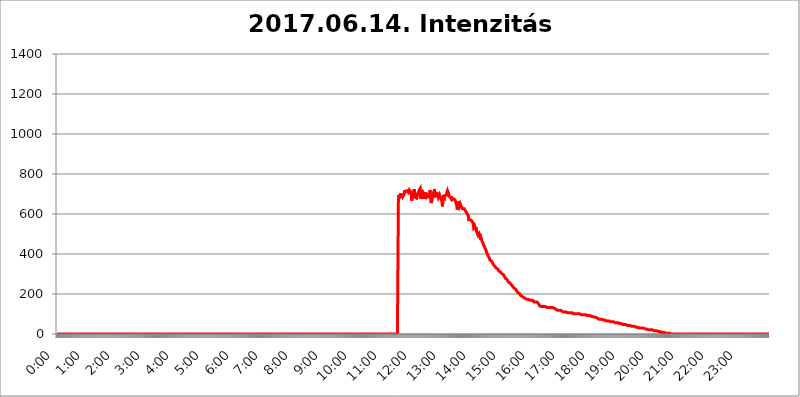
| Category | 2017.06.14. Intenzitás [W/m^2] |
|---|---|
| 0.0 | 0 |
| 0.0006944444444444445 | 0 |
| 0.001388888888888889 | 0 |
| 0.0020833333333333333 | 0 |
| 0.002777777777777778 | 0 |
| 0.003472222222222222 | 0 |
| 0.004166666666666667 | 0 |
| 0.004861111111111111 | 0 |
| 0.005555555555555556 | 0 |
| 0.0062499999999999995 | 0 |
| 0.006944444444444444 | 0 |
| 0.007638888888888889 | 0 |
| 0.008333333333333333 | 0 |
| 0.009027777777777779 | 0 |
| 0.009722222222222222 | 0 |
| 0.010416666666666666 | 0 |
| 0.011111111111111112 | 0 |
| 0.011805555555555555 | 0 |
| 0.012499999999999999 | 0 |
| 0.013194444444444444 | 0 |
| 0.013888888888888888 | 0 |
| 0.014583333333333332 | 0 |
| 0.015277777777777777 | 0 |
| 0.015972222222222224 | 0 |
| 0.016666666666666666 | 0 |
| 0.017361111111111112 | 0 |
| 0.018055555555555557 | 0 |
| 0.01875 | 0 |
| 0.019444444444444445 | 0 |
| 0.02013888888888889 | 0 |
| 0.020833333333333332 | 0 |
| 0.02152777777777778 | 0 |
| 0.022222222222222223 | 0 |
| 0.02291666666666667 | 0 |
| 0.02361111111111111 | 0 |
| 0.024305555555555556 | 0 |
| 0.024999999999999998 | 0 |
| 0.025694444444444447 | 0 |
| 0.02638888888888889 | 0 |
| 0.027083333333333334 | 0 |
| 0.027777777777777776 | 0 |
| 0.02847222222222222 | 0 |
| 0.029166666666666664 | 0 |
| 0.029861111111111113 | 0 |
| 0.030555555555555555 | 0 |
| 0.03125 | 0 |
| 0.03194444444444445 | 0 |
| 0.03263888888888889 | 0 |
| 0.03333333333333333 | 0 |
| 0.034027777777777775 | 0 |
| 0.034722222222222224 | 0 |
| 0.035416666666666666 | 0 |
| 0.036111111111111115 | 0 |
| 0.03680555555555556 | 0 |
| 0.0375 | 0 |
| 0.03819444444444444 | 0 |
| 0.03888888888888889 | 0 |
| 0.03958333333333333 | 0 |
| 0.04027777777777778 | 0 |
| 0.04097222222222222 | 0 |
| 0.041666666666666664 | 0 |
| 0.042361111111111106 | 0 |
| 0.04305555555555556 | 0 |
| 0.043750000000000004 | 0 |
| 0.044444444444444446 | 0 |
| 0.04513888888888889 | 0 |
| 0.04583333333333334 | 0 |
| 0.04652777777777778 | 0 |
| 0.04722222222222222 | 0 |
| 0.04791666666666666 | 0 |
| 0.04861111111111111 | 0 |
| 0.049305555555555554 | 0 |
| 0.049999999999999996 | 0 |
| 0.05069444444444445 | 0 |
| 0.051388888888888894 | 0 |
| 0.052083333333333336 | 0 |
| 0.05277777777777778 | 0 |
| 0.05347222222222222 | 0 |
| 0.05416666666666667 | 0 |
| 0.05486111111111111 | 0 |
| 0.05555555555555555 | 0 |
| 0.05625 | 0 |
| 0.05694444444444444 | 0 |
| 0.057638888888888885 | 0 |
| 0.05833333333333333 | 0 |
| 0.05902777777777778 | 0 |
| 0.059722222222222225 | 0 |
| 0.06041666666666667 | 0 |
| 0.061111111111111116 | 0 |
| 0.06180555555555556 | 0 |
| 0.0625 | 0 |
| 0.06319444444444444 | 0 |
| 0.06388888888888888 | 0 |
| 0.06458333333333334 | 0 |
| 0.06527777777777778 | 0 |
| 0.06597222222222222 | 0 |
| 0.06666666666666667 | 0 |
| 0.06736111111111111 | 0 |
| 0.06805555555555555 | 0 |
| 0.06874999999999999 | 0 |
| 0.06944444444444443 | 0 |
| 0.07013888888888889 | 0 |
| 0.07083333333333333 | 0 |
| 0.07152777777777779 | 0 |
| 0.07222222222222223 | 0 |
| 0.07291666666666667 | 0 |
| 0.07361111111111111 | 0 |
| 0.07430555555555556 | 0 |
| 0.075 | 0 |
| 0.07569444444444444 | 0 |
| 0.0763888888888889 | 0 |
| 0.07708333333333334 | 0 |
| 0.07777777777777778 | 0 |
| 0.07847222222222222 | 0 |
| 0.07916666666666666 | 0 |
| 0.0798611111111111 | 0 |
| 0.08055555555555556 | 0 |
| 0.08125 | 0 |
| 0.08194444444444444 | 0 |
| 0.08263888888888889 | 0 |
| 0.08333333333333333 | 0 |
| 0.08402777777777777 | 0 |
| 0.08472222222222221 | 0 |
| 0.08541666666666665 | 0 |
| 0.08611111111111112 | 0 |
| 0.08680555555555557 | 0 |
| 0.08750000000000001 | 0 |
| 0.08819444444444445 | 0 |
| 0.08888888888888889 | 0 |
| 0.08958333333333333 | 0 |
| 0.09027777777777778 | 0 |
| 0.09097222222222222 | 0 |
| 0.09166666666666667 | 0 |
| 0.09236111111111112 | 0 |
| 0.09305555555555556 | 0 |
| 0.09375 | 0 |
| 0.09444444444444444 | 0 |
| 0.09513888888888888 | 0 |
| 0.09583333333333333 | 0 |
| 0.09652777777777777 | 0 |
| 0.09722222222222222 | 0 |
| 0.09791666666666667 | 0 |
| 0.09861111111111111 | 0 |
| 0.09930555555555555 | 0 |
| 0.09999999999999999 | 0 |
| 0.10069444444444443 | 0 |
| 0.1013888888888889 | 0 |
| 0.10208333333333335 | 0 |
| 0.10277777777777779 | 0 |
| 0.10347222222222223 | 0 |
| 0.10416666666666667 | 0 |
| 0.10486111111111111 | 0 |
| 0.10555555555555556 | 0 |
| 0.10625 | 0 |
| 0.10694444444444444 | 0 |
| 0.1076388888888889 | 0 |
| 0.10833333333333334 | 0 |
| 0.10902777777777778 | 0 |
| 0.10972222222222222 | 0 |
| 0.1111111111111111 | 0 |
| 0.11180555555555556 | 0 |
| 0.11180555555555556 | 0 |
| 0.1125 | 0 |
| 0.11319444444444444 | 0 |
| 0.11388888888888889 | 0 |
| 0.11458333333333333 | 0 |
| 0.11527777777777777 | 0 |
| 0.11597222222222221 | 0 |
| 0.11666666666666665 | 0 |
| 0.1173611111111111 | 0 |
| 0.11805555555555557 | 0 |
| 0.11944444444444445 | 0 |
| 0.12013888888888889 | 0 |
| 0.12083333333333333 | 0 |
| 0.12152777777777778 | 0 |
| 0.12222222222222223 | 0 |
| 0.12291666666666667 | 0 |
| 0.12291666666666667 | 0 |
| 0.12361111111111112 | 0 |
| 0.12430555555555556 | 0 |
| 0.125 | 0 |
| 0.12569444444444444 | 0 |
| 0.12638888888888888 | 0 |
| 0.12708333333333333 | 0 |
| 0.16875 | 0 |
| 0.12847222222222224 | 0 |
| 0.12916666666666668 | 0 |
| 0.12986111111111112 | 0 |
| 0.13055555555555556 | 0 |
| 0.13125 | 0 |
| 0.13194444444444445 | 0 |
| 0.1326388888888889 | 0 |
| 0.13333333333333333 | 0 |
| 0.13402777777777777 | 0 |
| 0.13402777777777777 | 0 |
| 0.13472222222222222 | 0 |
| 0.13541666666666666 | 0 |
| 0.1361111111111111 | 0 |
| 0.13749999999999998 | 0 |
| 0.13819444444444443 | 0 |
| 0.1388888888888889 | 0 |
| 0.13958333333333334 | 0 |
| 0.14027777777777778 | 0 |
| 0.14097222222222222 | 0 |
| 0.14166666666666666 | 0 |
| 0.1423611111111111 | 0 |
| 0.14305555555555557 | 0 |
| 0.14375000000000002 | 0 |
| 0.14444444444444446 | 0 |
| 0.1451388888888889 | 0 |
| 0.1451388888888889 | 0 |
| 0.14652777777777778 | 0 |
| 0.14722222222222223 | 0 |
| 0.14791666666666667 | 0 |
| 0.1486111111111111 | 0 |
| 0.14930555555555555 | 0 |
| 0.15 | 0 |
| 0.15069444444444444 | 0 |
| 0.15138888888888888 | 0 |
| 0.15208333333333332 | 0 |
| 0.15277777777777776 | 0 |
| 0.15347222222222223 | 0 |
| 0.15416666666666667 | 0 |
| 0.15486111111111112 | 0 |
| 0.15555555555555556 | 0 |
| 0.15625 | 0 |
| 0.15694444444444444 | 0 |
| 0.15763888888888888 | 0 |
| 0.15833333333333333 | 0 |
| 0.15902777777777777 | 0 |
| 0.15972222222222224 | 0 |
| 0.16041666666666668 | 0 |
| 0.16111111111111112 | 0 |
| 0.16180555555555556 | 0 |
| 0.1625 | 0 |
| 0.16319444444444445 | 0 |
| 0.1638888888888889 | 0 |
| 0.16458333333333333 | 0 |
| 0.16527777777777777 | 0 |
| 0.16597222222222222 | 0 |
| 0.16666666666666666 | 0 |
| 0.1673611111111111 | 0 |
| 0.16805555555555554 | 0 |
| 0.16874999999999998 | 0 |
| 0.16944444444444443 | 0 |
| 0.17013888888888887 | 0 |
| 0.1708333333333333 | 0 |
| 0.17152777777777775 | 0 |
| 0.17222222222222225 | 0 |
| 0.1729166666666667 | 0 |
| 0.17361111111111113 | 0 |
| 0.17430555555555557 | 0 |
| 0.17500000000000002 | 0 |
| 0.17569444444444446 | 0 |
| 0.1763888888888889 | 0 |
| 0.17708333333333334 | 0 |
| 0.17777777777777778 | 0 |
| 0.17847222222222223 | 0 |
| 0.17916666666666667 | 0 |
| 0.1798611111111111 | 0 |
| 0.18055555555555555 | 0 |
| 0.18125 | 0 |
| 0.18194444444444444 | 0 |
| 0.1826388888888889 | 0 |
| 0.18333333333333335 | 0 |
| 0.1840277777777778 | 0 |
| 0.18472222222222223 | 0 |
| 0.18541666666666667 | 0 |
| 0.18611111111111112 | 0 |
| 0.18680555555555556 | 0 |
| 0.1875 | 0 |
| 0.18819444444444444 | 0 |
| 0.18888888888888888 | 0 |
| 0.18958333333333333 | 0 |
| 0.19027777777777777 | 0 |
| 0.1909722222222222 | 0 |
| 0.19166666666666665 | 0 |
| 0.19236111111111112 | 0 |
| 0.19305555555555554 | 0 |
| 0.19375 | 0 |
| 0.19444444444444445 | 0 |
| 0.1951388888888889 | 0 |
| 0.19583333333333333 | 0 |
| 0.19652777777777777 | 0 |
| 0.19722222222222222 | 0 |
| 0.19791666666666666 | 0 |
| 0.1986111111111111 | 0 |
| 0.19930555555555554 | 0 |
| 0.19999999999999998 | 0 |
| 0.20069444444444443 | 0 |
| 0.20138888888888887 | 0 |
| 0.2020833333333333 | 0 |
| 0.2027777777777778 | 0 |
| 0.2034722222222222 | 0 |
| 0.2041666666666667 | 0 |
| 0.20486111111111113 | 0 |
| 0.20555555555555557 | 0 |
| 0.20625000000000002 | 0 |
| 0.20694444444444446 | 0 |
| 0.2076388888888889 | 0 |
| 0.20833333333333334 | 0 |
| 0.20902777777777778 | 0 |
| 0.20972222222222223 | 0 |
| 0.21041666666666667 | 0 |
| 0.2111111111111111 | 0 |
| 0.21180555555555555 | 0 |
| 0.2125 | 0 |
| 0.21319444444444444 | 0 |
| 0.2138888888888889 | 0 |
| 0.21458333333333335 | 0 |
| 0.2152777777777778 | 0 |
| 0.21597222222222223 | 0 |
| 0.21666666666666667 | 0 |
| 0.21736111111111112 | 0 |
| 0.21805555555555556 | 0 |
| 0.21875 | 0 |
| 0.21944444444444444 | 0 |
| 0.22013888888888888 | 0 |
| 0.22083333333333333 | 0 |
| 0.22152777777777777 | 0 |
| 0.2222222222222222 | 0 |
| 0.22291666666666665 | 0 |
| 0.2236111111111111 | 0 |
| 0.22430555555555556 | 0 |
| 0.225 | 0 |
| 0.22569444444444445 | 0 |
| 0.2263888888888889 | 0 |
| 0.22708333333333333 | 0 |
| 0.22777777777777777 | 0 |
| 0.22847222222222222 | 0 |
| 0.22916666666666666 | 0 |
| 0.2298611111111111 | 0 |
| 0.23055555555555554 | 0 |
| 0.23124999999999998 | 0 |
| 0.23194444444444443 | 0 |
| 0.23263888888888887 | 0 |
| 0.2333333333333333 | 0 |
| 0.2340277777777778 | 0 |
| 0.2347222222222222 | 0 |
| 0.2354166666666667 | 0 |
| 0.23611111111111113 | 0 |
| 0.23680555555555557 | 0 |
| 0.23750000000000002 | 0 |
| 0.23819444444444446 | 0 |
| 0.2388888888888889 | 0 |
| 0.23958333333333334 | 0 |
| 0.24027777777777778 | 0 |
| 0.24097222222222223 | 0 |
| 0.24166666666666667 | 0 |
| 0.2423611111111111 | 0 |
| 0.24305555555555555 | 0 |
| 0.24375 | 0 |
| 0.24444444444444446 | 0 |
| 0.24513888888888888 | 0 |
| 0.24583333333333335 | 0 |
| 0.2465277777777778 | 0 |
| 0.24722222222222223 | 0 |
| 0.24791666666666667 | 0 |
| 0.24861111111111112 | 0 |
| 0.24930555555555556 | 0 |
| 0.25 | 0 |
| 0.25069444444444444 | 0 |
| 0.2513888888888889 | 0 |
| 0.2520833333333333 | 0 |
| 0.25277777777777777 | 0 |
| 0.2534722222222222 | 0 |
| 0.25416666666666665 | 0 |
| 0.2548611111111111 | 0 |
| 0.2555555555555556 | 0 |
| 0.25625000000000003 | 0 |
| 0.2569444444444445 | 0 |
| 0.2576388888888889 | 0 |
| 0.25833333333333336 | 0 |
| 0.2590277777777778 | 0 |
| 0.25972222222222224 | 0 |
| 0.2604166666666667 | 0 |
| 0.2611111111111111 | 0 |
| 0.26180555555555557 | 0 |
| 0.2625 | 0 |
| 0.26319444444444445 | 0 |
| 0.2638888888888889 | 0 |
| 0.26458333333333334 | 0 |
| 0.2652777777777778 | 0 |
| 0.2659722222222222 | 0 |
| 0.26666666666666666 | 0 |
| 0.2673611111111111 | 0 |
| 0.26805555555555555 | 0 |
| 0.26875 | 0 |
| 0.26944444444444443 | 0 |
| 0.2701388888888889 | 0 |
| 0.2708333333333333 | 0 |
| 0.27152777777777776 | 0 |
| 0.2722222222222222 | 0 |
| 0.27291666666666664 | 0 |
| 0.2736111111111111 | 0 |
| 0.2743055555555555 | 0 |
| 0.27499999999999997 | 0 |
| 0.27569444444444446 | 0 |
| 0.27638888888888885 | 0 |
| 0.27708333333333335 | 0 |
| 0.2777777777777778 | 0 |
| 0.27847222222222223 | 0 |
| 0.2791666666666667 | 0 |
| 0.2798611111111111 | 0 |
| 0.28055555555555556 | 0 |
| 0.28125 | 0 |
| 0.28194444444444444 | 0 |
| 0.2826388888888889 | 0 |
| 0.2833333333333333 | 0 |
| 0.28402777777777777 | 0 |
| 0.2847222222222222 | 0 |
| 0.28541666666666665 | 0 |
| 0.28611111111111115 | 0 |
| 0.28680555555555554 | 0 |
| 0.28750000000000003 | 0 |
| 0.2881944444444445 | 0 |
| 0.2888888888888889 | 0 |
| 0.28958333333333336 | 0 |
| 0.2902777777777778 | 0 |
| 0.29097222222222224 | 0 |
| 0.2916666666666667 | 0 |
| 0.2923611111111111 | 0 |
| 0.29305555555555557 | 0 |
| 0.29375 | 0 |
| 0.29444444444444445 | 0 |
| 0.2951388888888889 | 0 |
| 0.29583333333333334 | 0 |
| 0.2965277777777778 | 0 |
| 0.2972222222222222 | 0 |
| 0.29791666666666666 | 0 |
| 0.2986111111111111 | 0 |
| 0.29930555555555555 | 0 |
| 0.3 | 0 |
| 0.30069444444444443 | 0 |
| 0.3013888888888889 | 0 |
| 0.3020833333333333 | 0 |
| 0.30277777777777776 | 0 |
| 0.3034722222222222 | 0 |
| 0.30416666666666664 | 0 |
| 0.3048611111111111 | 0 |
| 0.3055555555555555 | 0 |
| 0.30624999999999997 | 0 |
| 0.3069444444444444 | 0 |
| 0.3076388888888889 | 0 |
| 0.30833333333333335 | 0 |
| 0.3090277777777778 | 0 |
| 0.30972222222222223 | 0 |
| 0.3104166666666667 | 0 |
| 0.3111111111111111 | 0 |
| 0.31180555555555556 | 0 |
| 0.3125 | 0 |
| 0.31319444444444444 | 0 |
| 0.3138888888888889 | 0 |
| 0.3145833333333333 | 0 |
| 0.31527777777777777 | 0 |
| 0.3159722222222222 | 0 |
| 0.31666666666666665 | 0 |
| 0.31736111111111115 | 0 |
| 0.31805555555555554 | 0 |
| 0.31875000000000003 | 0 |
| 0.3194444444444445 | 0 |
| 0.3201388888888889 | 0 |
| 0.32083333333333336 | 0 |
| 0.3215277777777778 | 0 |
| 0.32222222222222224 | 0 |
| 0.3229166666666667 | 0 |
| 0.3236111111111111 | 0 |
| 0.32430555555555557 | 0 |
| 0.325 | 0 |
| 0.32569444444444445 | 0 |
| 0.3263888888888889 | 0 |
| 0.32708333333333334 | 0 |
| 0.3277777777777778 | 0 |
| 0.3284722222222222 | 0 |
| 0.32916666666666666 | 0 |
| 0.3298611111111111 | 0 |
| 0.33055555555555555 | 0 |
| 0.33125 | 0 |
| 0.33194444444444443 | 0 |
| 0.3326388888888889 | 0 |
| 0.3333333333333333 | 0 |
| 0.3340277777777778 | 0 |
| 0.3347222222222222 | 0 |
| 0.3354166666666667 | 0 |
| 0.3361111111111111 | 0 |
| 0.3368055555555556 | 0 |
| 0.33749999999999997 | 0 |
| 0.33819444444444446 | 0 |
| 0.33888888888888885 | 0 |
| 0.33958333333333335 | 0 |
| 0.34027777777777773 | 0 |
| 0.34097222222222223 | 0 |
| 0.3416666666666666 | 0 |
| 0.3423611111111111 | 0 |
| 0.3430555555555555 | 0 |
| 0.34375 | 0 |
| 0.3444444444444445 | 0 |
| 0.3451388888888889 | 0 |
| 0.3458333333333334 | 0 |
| 0.34652777777777777 | 0 |
| 0.34722222222222227 | 0 |
| 0.34791666666666665 | 0 |
| 0.34861111111111115 | 0 |
| 0.34930555555555554 | 0 |
| 0.35000000000000003 | 0 |
| 0.3506944444444444 | 0 |
| 0.3513888888888889 | 0 |
| 0.3520833333333333 | 0 |
| 0.3527777777777778 | 0 |
| 0.3534722222222222 | 0 |
| 0.3541666666666667 | 0 |
| 0.3548611111111111 | 0 |
| 0.35555555555555557 | 0 |
| 0.35625 | 0 |
| 0.35694444444444445 | 0 |
| 0.3576388888888889 | 0 |
| 0.35833333333333334 | 0 |
| 0.3590277777777778 | 0 |
| 0.3597222222222222 | 0 |
| 0.36041666666666666 | 0 |
| 0.3611111111111111 | 0 |
| 0.36180555555555555 | 0 |
| 0.3625 | 0 |
| 0.36319444444444443 | 0 |
| 0.3638888888888889 | 0 |
| 0.3645833333333333 | 0 |
| 0.3652777777777778 | 0 |
| 0.3659722222222222 | 0 |
| 0.3666666666666667 | 0 |
| 0.3673611111111111 | 0 |
| 0.3680555555555556 | 0 |
| 0.36874999999999997 | 0 |
| 0.36944444444444446 | 0 |
| 0.37013888888888885 | 0 |
| 0.37083333333333335 | 0 |
| 0.37152777777777773 | 0 |
| 0.37222222222222223 | 0 |
| 0.3729166666666666 | 0 |
| 0.3736111111111111 | 0 |
| 0.3743055555555555 | 0 |
| 0.375 | 0 |
| 0.3756944444444445 | 0 |
| 0.3763888888888889 | 0 |
| 0.3770833333333334 | 0 |
| 0.37777777777777777 | 0 |
| 0.37847222222222227 | 0 |
| 0.37916666666666665 | 0 |
| 0.37986111111111115 | 0 |
| 0.38055555555555554 | 0 |
| 0.38125000000000003 | 0 |
| 0.3819444444444444 | 0 |
| 0.3826388888888889 | 0 |
| 0.3833333333333333 | 0 |
| 0.3840277777777778 | 0 |
| 0.3847222222222222 | 0 |
| 0.3854166666666667 | 0 |
| 0.3861111111111111 | 0 |
| 0.38680555555555557 | 0 |
| 0.3875 | 0 |
| 0.38819444444444445 | 0 |
| 0.3888888888888889 | 0 |
| 0.38958333333333334 | 0 |
| 0.3902777777777778 | 0 |
| 0.3909722222222222 | 0 |
| 0.39166666666666666 | 0 |
| 0.3923611111111111 | 0 |
| 0.39305555555555555 | 0 |
| 0.39375 | 0 |
| 0.39444444444444443 | 0 |
| 0.3951388888888889 | 0 |
| 0.3958333333333333 | 0 |
| 0.3965277777777778 | 0 |
| 0.3972222222222222 | 0 |
| 0.3979166666666667 | 0 |
| 0.3986111111111111 | 0 |
| 0.3993055555555556 | 0 |
| 0.39999999999999997 | 0 |
| 0.40069444444444446 | 0 |
| 0.40138888888888885 | 0 |
| 0.40208333333333335 | 0 |
| 0.40277777777777773 | 0 |
| 0.40347222222222223 | 0 |
| 0.4041666666666666 | 0 |
| 0.4048611111111111 | 0 |
| 0.4055555555555555 | 0 |
| 0.40625 | 0 |
| 0.4069444444444445 | 0 |
| 0.4076388888888889 | 0 |
| 0.4083333333333334 | 0 |
| 0.40902777777777777 | 0 |
| 0.40972222222222227 | 0 |
| 0.41041666666666665 | 0 |
| 0.41111111111111115 | 0 |
| 0.41180555555555554 | 0 |
| 0.41250000000000003 | 0 |
| 0.4131944444444444 | 0 |
| 0.4138888888888889 | 0 |
| 0.4145833333333333 | 0 |
| 0.4152777777777778 | 0 |
| 0.4159722222222222 | 0 |
| 0.4166666666666667 | 0 |
| 0.4173611111111111 | 0 |
| 0.41805555555555557 | 0 |
| 0.41875 | 0 |
| 0.41944444444444445 | 0 |
| 0.4201388888888889 | 0 |
| 0.42083333333333334 | 0 |
| 0.4215277777777778 | 0 |
| 0.4222222222222222 | 0 |
| 0.42291666666666666 | 0 |
| 0.4236111111111111 | 0 |
| 0.42430555555555555 | 0 |
| 0.425 | 0 |
| 0.42569444444444443 | 0 |
| 0.4263888888888889 | 0 |
| 0.4270833333333333 | 0 |
| 0.4277777777777778 | 0 |
| 0.4284722222222222 | 0 |
| 0.4291666666666667 | 0 |
| 0.4298611111111111 | 0 |
| 0.4305555555555556 | 0 |
| 0.43124999999999997 | 0 |
| 0.43194444444444446 | 0 |
| 0.43263888888888885 | 0 |
| 0.43333333333333335 | 0 |
| 0.43402777777777773 | 0 |
| 0.43472222222222223 | 0 |
| 0.4354166666666666 | 0 |
| 0.4361111111111111 | 0 |
| 0.4368055555555555 | 0 |
| 0.4375 | 0 |
| 0.4381944444444445 | 0 |
| 0.4388888888888889 | 0 |
| 0.4395833333333334 | 0 |
| 0.44027777777777777 | 0 |
| 0.44097222222222227 | 0 |
| 0.44166666666666665 | 0 |
| 0.44236111111111115 | 0 |
| 0.44305555555555554 | 0 |
| 0.44375000000000003 | 0 |
| 0.4444444444444444 | 0 |
| 0.4451388888888889 | 0 |
| 0.4458333333333333 | 0 |
| 0.4465277777777778 | 0 |
| 0.4472222222222222 | 0 |
| 0.4479166666666667 | 0 |
| 0.4486111111111111 | 0 |
| 0.44930555555555557 | 0 |
| 0.45 | 0 |
| 0.45069444444444445 | 0 |
| 0.4513888888888889 | 0 |
| 0.45208333333333334 | 0 |
| 0.4527777777777778 | 0 |
| 0.4534722222222222 | 0 |
| 0.45416666666666666 | 0 |
| 0.4548611111111111 | 0 |
| 0.45555555555555555 | 0 |
| 0.45625 | 0 |
| 0.45694444444444443 | 0 |
| 0.4576388888888889 | 0 |
| 0.4583333333333333 | 0 |
| 0.4590277777777778 | 0 |
| 0.4597222222222222 | 0 |
| 0.4604166666666667 | 0 |
| 0.4611111111111111 | 0 |
| 0.4618055555555556 | 0 |
| 0.46249999999999997 | 0 |
| 0.46319444444444446 | 0 |
| 0.46388888888888885 | 0 |
| 0.46458333333333335 | 0 |
| 0.46527777777777773 | 0 |
| 0.46597222222222223 | 0 |
| 0.4666666666666666 | 0 |
| 0.4673611111111111 | 0 |
| 0.4680555555555555 | 0 |
| 0.46875 | 0 |
| 0.4694444444444445 | 0 |
| 0.4701388888888889 | 0 |
| 0.4708333333333334 | 0 |
| 0.47152777777777777 | 0 |
| 0.47222222222222227 | 0 |
| 0.47291666666666665 | 0 |
| 0.47361111111111115 | 0 |
| 0.47430555555555554 | 0 |
| 0.47500000000000003 | 0 |
| 0.4756944444444444 | 0 |
| 0.4763888888888889 | 0 |
| 0.4770833333333333 | 0 |
| 0.4777777777777778 | 0 |
| 0.4784722222222222 | 671.22 |
| 0.4791666666666667 | 695.666 |
| 0.4798611111111111 | 683.473 |
| 0.48055555555555557 | 679.395 |
| 0.48125 | 695.666 |
| 0.48194444444444445 | 703.762 |
| 0.4826388888888889 | 687.544 |
| 0.48333333333333334 | 679.395 |
| 0.4840277777777778 | 699.717 |
| 0.4847222222222222 | 687.544 |
| 0.48541666666666666 | 683.473 |
| 0.4861111111111111 | 695.666 |
| 0.48680555555555555 | 703.762 |
| 0.4875 | 719.877 |
| 0.48819444444444443 | 711.832 |
| 0.4888888888888889 | 715.858 |
| 0.4895833333333333 | 715.858 |
| 0.4902777777777778 | 715.858 |
| 0.4909722222222222 | 719.877 |
| 0.4916666666666667 | 719.877 |
| 0.4923611111111111 | 707.8 |
| 0.4930555555555556 | 711.832 |
| 0.49374999999999997 | 719.877 |
| 0.49444444444444446 | 715.858 |
| 0.49513888888888885 | 715.858 |
| 0.49583333333333335 | 707.8 |
| 0.49652777777777773 | 699.717 |
| 0.49722222222222223 | 667.123 |
| 0.4979166666666666 | 695.666 |
| 0.4986111111111111 | 683.473 |
| 0.4993055555555555 | 683.473 |
| 0.5 | 687.544 |
| 0.5006944444444444 | 723.889 |
| 0.5013888888888889 | 719.877 |
| 0.5020833333333333 | 683.473 |
| 0.5027777777777778 | 687.544 |
| 0.5034722222222222 | 683.473 |
| 0.5041666666666667 | 679.395 |
| 0.5048611111111111 | 691.608 |
| 0.5055555555555555 | 699.717 |
| 0.50625 | 703.762 |
| 0.5069444444444444 | 711.832 |
| 0.5076388888888889 | 719.877 |
| 0.5083333333333333 | 715.858 |
| 0.5090277777777777 | 727.896 |
| 0.5097222222222222 | 675.311 |
| 0.5104166666666666 | 699.717 |
| 0.5111111111111112 | 719.877 |
| 0.5118055555555555 | 711.832 |
| 0.5125000000000001 | 675.311 |
| 0.5131944444444444 | 707.8 |
| 0.513888888888889 | 707.8 |
| 0.5145833333333333 | 711.832 |
| 0.5152777777777778 | 699.717 |
| 0.5159722222222222 | 675.311 |
| 0.5166666666666667 | 707.8 |
| 0.517361111111111 | 707.8 |
| 0.5180555555555556 | 687.544 |
| 0.5187499999999999 | 687.544 |
| 0.5194444444444445 | 695.666 |
| 0.5201388888888888 | 703.762 |
| 0.5208333333333334 | 679.395 |
| 0.5215277777777778 | 683.473 |
| 0.5222222222222223 | 699.717 |
| 0.5229166666666667 | 719.877 |
| 0.5236111111111111 | 683.473 |
| 0.5243055555555556 | 654.791 |
| 0.525 | 658.909 |
| 0.5256944444444445 | 671.22 |
| 0.5263888888888889 | 683.473 |
| 0.5270833333333333 | 695.666 |
| 0.5277777777777778 | 703.762 |
| 0.5284722222222222 | 695.666 |
| 0.5291666666666667 | 723.889 |
| 0.5298611111111111 | 683.473 |
| 0.5305555555555556 | 707.8 |
| 0.53125 | 691.608 |
| 0.5319444444444444 | 691.608 |
| 0.5326388888888889 | 707.8 |
| 0.5333333333333333 | 687.544 |
| 0.5340277777777778 | 695.666 |
| 0.5347222222222222 | 683.473 |
| 0.5354166666666667 | 683.473 |
| 0.5361111111111111 | 695.666 |
| 0.5368055555555555 | 687.544 |
| 0.5375 | 683.473 |
| 0.5381944444444444 | 687.544 |
| 0.5388888888888889 | 671.22 |
| 0.5395833333333333 | 687.544 |
| 0.5402777777777777 | 638.256 |
| 0.5409722222222222 | 675.311 |
| 0.5416666666666666 | 695.666 |
| 0.5423611111111112 | 667.123 |
| 0.5430555555555555 | 683.473 |
| 0.5437500000000001 | 691.608 |
| 0.5444444444444444 | 695.666 |
| 0.545138888888889 | 691.608 |
| 0.5458333333333333 | 695.666 |
| 0.5465277777777778 | 707.8 |
| 0.5472222222222222 | 715.858 |
| 0.5479166666666667 | 707.8 |
| 0.548611111111111 | 687.544 |
| 0.5493055555555556 | 695.666 |
| 0.5499999999999999 | 687.544 |
| 0.5506944444444445 | 687.544 |
| 0.5513888888888888 | 691.608 |
| 0.5520833333333334 | 679.395 |
| 0.5527777777777778 | 687.544 |
| 0.5534722222222223 | 671.22 |
| 0.5541666666666667 | 671.22 |
| 0.5548611111111111 | 667.123 |
| 0.5555555555555556 | 675.311 |
| 0.55625 | 675.311 |
| 0.5569444444444445 | 671.22 |
| 0.5576388888888889 | 671.22 |
| 0.5583333333333333 | 667.123 |
| 0.5590277777777778 | 658.909 |
| 0.5597222222222222 | 646.537 |
| 0.5604166666666667 | 654.791 |
| 0.5611111111111111 | 621.613 |
| 0.5618055555555556 | 625.784 |
| 0.5625 | 634.105 |
| 0.5631944444444444 | 663.019 |
| 0.5638888888888889 | 658.909 |
| 0.5645833333333333 | 642.4 |
| 0.5652777777777778 | 650.667 |
| 0.5659722222222222 | 646.537 |
| 0.5666666666666667 | 638.256 |
| 0.5673611111111111 | 634.105 |
| 0.5680555555555555 | 634.105 |
| 0.56875 | 625.784 |
| 0.5694444444444444 | 625.784 |
| 0.5701388888888889 | 625.784 |
| 0.5708333333333333 | 625.784 |
| 0.5715277777777777 | 621.613 |
| 0.5722222222222222 | 617.436 |
| 0.5729166666666666 | 613.252 |
| 0.5736111111111112 | 609.062 |
| 0.5743055555555555 | 604.864 |
| 0.5750000000000001 | 600.661 |
| 0.5756944444444444 | 596.45 |
| 0.576388888888889 | 592.233 |
| 0.5770833333333333 | 571.049 |
| 0.5777777777777778 | 575.299 |
| 0.5784722222222222 | 575.299 |
| 0.5791666666666667 | 571.049 |
| 0.579861111111111 | 566.793 |
| 0.5805555555555556 | 566.793 |
| 0.5812499999999999 | 566.793 |
| 0.5819444444444445 | 562.53 |
| 0.5826388888888888 | 558.261 |
| 0.5833333333333334 | 549.704 |
| 0.5840277777777778 | 532.513 |
| 0.5847222222222223 | 532.513 |
| 0.5854166666666667 | 541.121 |
| 0.5861111111111111 | 532.513 |
| 0.5868055555555556 | 519.555 |
| 0.5875 | 532.513 |
| 0.5881944444444445 | 510.885 |
| 0.5888888888888889 | 510.885 |
| 0.5895833333333333 | 506.542 |
| 0.5902777777777778 | 493.475 |
| 0.5909722222222222 | 489.108 |
| 0.5916666666666667 | 502.192 |
| 0.5923611111111111 | 497.836 |
| 0.5930555555555556 | 489.108 |
| 0.59375 | 471.582 |
| 0.5944444444444444 | 480.356 |
| 0.5951388888888889 | 471.582 |
| 0.5958333333333333 | 462.786 |
| 0.5965277777777778 | 458.38 |
| 0.5972222222222222 | 453.968 |
| 0.5979166666666667 | 445.129 |
| 0.5986111111111111 | 440.702 |
| 0.5993055555555555 | 436.27 |
| 0.6 | 427.39 |
| 0.6006944444444444 | 422.943 |
| 0.6013888888888889 | 418.492 |
| 0.6020833333333333 | 409.574 |
| 0.6027777777777777 | 405.108 |
| 0.6034722222222222 | 396.164 |
| 0.6041666666666666 | 391.685 |
| 0.6048611111111112 | 387.202 |
| 0.6055555555555555 | 382.715 |
| 0.6062500000000001 | 378.224 |
| 0.6069444444444444 | 369.23 |
| 0.607638888888889 | 369.23 |
| 0.6083333333333333 | 364.728 |
| 0.6090277777777778 | 364.728 |
| 0.6097222222222222 | 360.221 |
| 0.6104166666666667 | 355.712 |
| 0.611111111111111 | 351.198 |
| 0.6118055555555556 | 346.682 |
| 0.6124999999999999 | 346.682 |
| 0.6131944444444445 | 342.162 |
| 0.6138888888888888 | 337.639 |
| 0.6145833333333334 | 333.113 |
| 0.6152777777777778 | 333.113 |
| 0.6159722222222223 | 328.584 |
| 0.6166666666666667 | 328.584 |
| 0.6173611111111111 | 324.052 |
| 0.6180555555555556 | 324.052 |
| 0.61875 | 319.517 |
| 0.6194444444444445 | 314.98 |
| 0.6201388888888889 | 314.98 |
| 0.6208333333333333 | 310.44 |
| 0.6215277777777778 | 310.44 |
| 0.6222222222222222 | 305.898 |
| 0.6229166666666667 | 305.898 |
| 0.6236111111111111 | 301.354 |
| 0.6243055555555556 | 296.808 |
| 0.625 | 296.808 |
| 0.6256944444444444 | 296.808 |
| 0.6263888888888889 | 292.259 |
| 0.6270833333333333 | 287.709 |
| 0.6277777777777778 | 283.156 |
| 0.6284722222222222 | 278.603 |
| 0.6291666666666667 | 278.603 |
| 0.6298611111111111 | 278.603 |
| 0.6305555555555555 | 274.047 |
| 0.63125 | 269.49 |
| 0.6319444444444444 | 269.49 |
| 0.6326388888888889 | 260.373 |
| 0.6333333333333333 | 260.373 |
| 0.6340277777777777 | 255.813 |
| 0.6347222222222222 | 255.813 |
| 0.6354166666666666 | 251.251 |
| 0.6361111111111112 | 251.251 |
| 0.6368055555555555 | 246.689 |
| 0.6375000000000001 | 242.127 |
| 0.6381944444444444 | 242.127 |
| 0.638888888888889 | 237.564 |
| 0.6395833333333333 | 233 |
| 0.6402777777777778 | 233 |
| 0.6409722222222222 | 228.436 |
| 0.6416666666666667 | 228.436 |
| 0.642361111111111 | 223.873 |
| 0.6430555555555556 | 223.873 |
| 0.6437499999999999 | 219.309 |
| 0.6444444444444445 | 214.746 |
| 0.6451388888888888 | 214.746 |
| 0.6458333333333334 | 210.182 |
| 0.6465277777777778 | 205.62 |
| 0.6472222222222223 | 201.058 |
| 0.6479166666666667 | 201.058 |
| 0.6486111111111111 | 201.058 |
| 0.6493055555555556 | 196.497 |
| 0.65 | 191.937 |
| 0.6506944444444445 | 191.937 |
| 0.6513888888888889 | 191.937 |
| 0.6520833333333333 | 187.378 |
| 0.6527777777777778 | 187.378 |
| 0.6534722222222222 | 182.82 |
| 0.6541666666666667 | 182.82 |
| 0.6548611111111111 | 182.82 |
| 0.6555555555555556 | 178.264 |
| 0.65625 | 178.264 |
| 0.6569444444444444 | 178.264 |
| 0.6576388888888889 | 178.264 |
| 0.6583333333333333 | 173.709 |
| 0.6590277777777778 | 178.264 |
| 0.6597222222222222 | 173.709 |
| 0.6604166666666667 | 173.709 |
| 0.6611111111111111 | 173.709 |
| 0.6618055555555555 | 173.709 |
| 0.6625 | 169.156 |
| 0.6631944444444444 | 169.156 |
| 0.6638888888888889 | 169.156 |
| 0.6645833333333333 | 169.156 |
| 0.6652777777777777 | 169.156 |
| 0.6659722222222222 | 169.156 |
| 0.6666666666666666 | 169.156 |
| 0.6673611111111111 | 164.605 |
| 0.6680555555555556 | 164.605 |
| 0.6687500000000001 | 160.056 |
| 0.6694444444444444 | 160.056 |
| 0.6701388888888888 | 160.056 |
| 0.6708333333333334 | 160.056 |
| 0.6715277777777778 | 160.056 |
| 0.6722222222222222 | 160.056 |
| 0.6729166666666666 | 160.056 |
| 0.6736111111111112 | 155.509 |
| 0.6743055555555556 | 155.509 |
| 0.6749999999999999 | 150.964 |
| 0.6756944444444444 | 146.423 |
| 0.6763888888888889 | 141.884 |
| 0.6770833333333334 | 141.884 |
| 0.6777777777777777 | 137.347 |
| 0.6784722222222223 | 137.347 |
| 0.6791666666666667 | 137.347 |
| 0.6798611111111111 | 137.347 |
| 0.6805555555555555 | 137.347 |
| 0.68125 | 137.347 |
| 0.6819444444444445 | 137.347 |
| 0.6826388888888889 | 137.347 |
| 0.6833333333333332 | 137.347 |
| 0.6840277777777778 | 137.347 |
| 0.6847222222222222 | 137.347 |
| 0.6854166666666667 | 137.347 |
| 0.686111111111111 | 137.347 |
| 0.6868055555555556 | 132.814 |
| 0.6875 | 132.814 |
| 0.6881944444444444 | 132.814 |
| 0.688888888888889 | 132.814 |
| 0.6895833333333333 | 132.814 |
| 0.6902777777777778 | 132.814 |
| 0.6909722222222222 | 132.814 |
| 0.6916666666666668 | 132.814 |
| 0.6923611111111111 | 132.814 |
| 0.6930555555555555 | 132.814 |
| 0.69375 | 132.814 |
| 0.6944444444444445 | 132.814 |
| 0.6951388888888889 | 132.814 |
| 0.6958333333333333 | 128.284 |
| 0.6965277777777777 | 128.284 |
| 0.6972222222222223 | 128.284 |
| 0.6979166666666666 | 128.284 |
| 0.6986111111111111 | 123.758 |
| 0.6993055555555556 | 123.758 |
| 0.7000000000000001 | 123.758 |
| 0.7006944444444444 | 123.758 |
| 0.7013888888888888 | 119.235 |
| 0.7020833333333334 | 119.235 |
| 0.7027777777777778 | 119.235 |
| 0.7034722222222222 | 119.235 |
| 0.7041666666666666 | 119.235 |
| 0.7048611111111112 | 119.235 |
| 0.7055555555555556 | 119.235 |
| 0.7062499999999999 | 114.716 |
| 0.7069444444444444 | 114.716 |
| 0.7076388888888889 | 114.716 |
| 0.7083333333333334 | 110.201 |
| 0.7090277777777777 | 110.201 |
| 0.7097222222222223 | 110.201 |
| 0.7104166666666667 | 110.201 |
| 0.7111111111111111 | 110.201 |
| 0.7118055555555555 | 110.201 |
| 0.7125 | 110.201 |
| 0.7131944444444445 | 110.201 |
| 0.7138888888888889 | 110.201 |
| 0.7145833333333332 | 110.201 |
| 0.7152777777777778 | 110.201 |
| 0.7159722222222222 | 105.69 |
| 0.7166666666666667 | 105.69 |
| 0.717361111111111 | 105.69 |
| 0.7180555555555556 | 105.69 |
| 0.71875 | 105.69 |
| 0.7194444444444444 | 105.69 |
| 0.720138888888889 | 105.69 |
| 0.7208333333333333 | 101.184 |
| 0.7215277777777778 | 101.184 |
| 0.7222222222222222 | 105.69 |
| 0.7229166666666668 | 101.184 |
| 0.7236111111111111 | 101.184 |
| 0.7243055555555555 | 101.184 |
| 0.725 | 101.184 |
| 0.7256944444444445 | 101.184 |
| 0.7263888888888889 | 101.184 |
| 0.7270833333333333 | 101.184 |
| 0.7277777777777777 | 101.184 |
| 0.7284722222222223 | 101.184 |
| 0.7291666666666666 | 101.184 |
| 0.7298611111111111 | 101.184 |
| 0.7305555555555556 | 101.184 |
| 0.7312500000000001 | 101.184 |
| 0.7319444444444444 | 101.184 |
| 0.7326388888888888 | 101.184 |
| 0.7333333333333334 | 96.682 |
| 0.7340277777777778 | 96.682 |
| 0.7347222222222222 | 96.682 |
| 0.7354166666666666 | 96.682 |
| 0.7361111111111112 | 96.682 |
| 0.7368055555555556 | 96.682 |
| 0.7374999999999999 | 96.682 |
| 0.7381944444444444 | 96.682 |
| 0.7388888888888889 | 96.682 |
| 0.7395833333333334 | 96.682 |
| 0.7402777777777777 | 96.682 |
| 0.7409722222222223 | 96.682 |
| 0.7416666666666667 | 92.184 |
| 0.7423611111111111 | 92.184 |
| 0.7430555555555555 | 92.184 |
| 0.74375 | 92.184 |
| 0.7444444444444445 | 92.184 |
| 0.7451388888888889 | 92.184 |
| 0.7458333333333332 | 92.184 |
| 0.7465277777777778 | 92.184 |
| 0.7472222222222222 | 92.184 |
| 0.7479166666666667 | 92.184 |
| 0.748611111111111 | 92.184 |
| 0.7493055555555556 | 87.692 |
| 0.75 | 87.692 |
| 0.7506944444444444 | 87.692 |
| 0.751388888888889 | 87.692 |
| 0.7520833333333333 | 87.692 |
| 0.7527777777777778 | 83.205 |
| 0.7534722222222222 | 83.205 |
| 0.7541666666666668 | 83.205 |
| 0.7548611111111111 | 83.205 |
| 0.7555555555555555 | 83.205 |
| 0.75625 | 78.722 |
| 0.7569444444444445 | 78.722 |
| 0.7576388888888889 | 78.722 |
| 0.7583333333333333 | 78.722 |
| 0.7590277777777777 | 74.246 |
| 0.7597222222222223 | 74.246 |
| 0.7604166666666666 | 74.246 |
| 0.7611111111111111 | 74.246 |
| 0.7618055555555556 | 74.246 |
| 0.7625000000000001 | 74.246 |
| 0.7631944444444444 | 74.246 |
| 0.7638888888888888 | 74.246 |
| 0.7645833333333334 | 74.246 |
| 0.7652777777777778 | 74.246 |
| 0.7659722222222222 | 69.775 |
| 0.7666666666666666 | 69.775 |
| 0.7673611111111112 | 69.775 |
| 0.7680555555555556 | 69.775 |
| 0.7687499999999999 | 65.31 |
| 0.7694444444444444 | 65.31 |
| 0.7701388888888889 | 65.31 |
| 0.7708333333333334 | 65.31 |
| 0.7715277777777777 | 65.31 |
| 0.7722222222222223 | 65.31 |
| 0.7729166666666667 | 65.31 |
| 0.7736111111111111 | 65.31 |
| 0.7743055555555555 | 65.31 |
| 0.775 | 65.31 |
| 0.7756944444444445 | 65.31 |
| 0.7763888888888889 | 60.85 |
| 0.7770833333333332 | 60.85 |
| 0.7777777777777778 | 60.85 |
| 0.7784722222222222 | 60.85 |
| 0.7791666666666667 | 60.85 |
| 0.779861111111111 | 60.85 |
| 0.7805555555555556 | 60.85 |
| 0.78125 | 60.85 |
| 0.7819444444444444 | 56.398 |
| 0.782638888888889 | 56.398 |
| 0.7833333333333333 | 56.398 |
| 0.7840277777777778 | 56.398 |
| 0.7847222222222222 | 56.398 |
| 0.7854166666666668 | 56.398 |
| 0.7861111111111111 | 56.398 |
| 0.7868055555555555 | 56.398 |
| 0.7875 | 56.398 |
| 0.7881944444444445 | 51.951 |
| 0.7888888888888889 | 51.951 |
| 0.7895833333333333 | 51.951 |
| 0.7902777777777777 | 51.951 |
| 0.7909722222222223 | 51.951 |
| 0.7916666666666666 | 51.951 |
| 0.7923611111111111 | 47.511 |
| 0.7930555555555556 | 47.511 |
| 0.7937500000000001 | 47.511 |
| 0.7944444444444444 | 47.511 |
| 0.7951388888888888 | 47.511 |
| 0.7958333333333334 | 47.511 |
| 0.7965277777777778 | 47.511 |
| 0.7972222222222222 | 47.511 |
| 0.7979166666666666 | 47.511 |
| 0.7986111111111112 | 43.079 |
| 0.7993055555555556 | 43.079 |
| 0.7999999999999999 | 43.079 |
| 0.8006944444444444 | 43.079 |
| 0.8013888888888889 | 43.079 |
| 0.8020833333333334 | 43.079 |
| 0.8027777777777777 | 43.079 |
| 0.8034722222222223 | 43.079 |
| 0.8041666666666667 | 38.653 |
| 0.8048611111111111 | 38.653 |
| 0.8055555555555555 | 38.653 |
| 0.80625 | 38.653 |
| 0.8069444444444445 | 38.653 |
| 0.8076388888888889 | 38.653 |
| 0.8083333333333332 | 38.653 |
| 0.8090277777777778 | 38.653 |
| 0.8097222222222222 | 38.653 |
| 0.8104166666666667 | 38.653 |
| 0.811111111111111 | 34.234 |
| 0.8118055555555556 | 34.234 |
| 0.8125 | 34.234 |
| 0.8131944444444444 | 34.234 |
| 0.813888888888889 | 34.234 |
| 0.8145833333333333 | 34.234 |
| 0.8152777777777778 | 29.823 |
| 0.8159722222222222 | 29.823 |
| 0.8166666666666668 | 29.823 |
| 0.8173611111111111 | 29.823 |
| 0.8180555555555555 | 29.823 |
| 0.81875 | 29.823 |
| 0.8194444444444445 | 29.823 |
| 0.8201388888888889 | 29.823 |
| 0.8208333333333333 | 29.823 |
| 0.8215277777777777 | 29.823 |
| 0.8222222222222223 | 29.823 |
| 0.8229166666666666 | 29.823 |
| 0.8236111111111111 | 29.823 |
| 0.8243055555555556 | 25.419 |
| 0.8250000000000001 | 25.419 |
| 0.8256944444444444 | 25.419 |
| 0.8263888888888888 | 25.419 |
| 0.8270833333333334 | 25.419 |
| 0.8277777777777778 | 25.419 |
| 0.8284722222222222 | 21.024 |
| 0.8291666666666666 | 21.024 |
| 0.8298611111111112 | 21.024 |
| 0.8305555555555556 | 21.024 |
| 0.8312499999999999 | 21.024 |
| 0.8319444444444444 | 21.024 |
| 0.8326388888888889 | 21.024 |
| 0.8333333333333334 | 21.024 |
| 0.8340277777777777 | 21.024 |
| 0.8347222222222223 | 21.024 |
| 0.8354166666666667 | 21.024 |
| 0.8361111111111111 | 21.024 |
| 0.8368055555555555 | 16.636 |
| 0.8375 | 16.636 |
| 0.8381944444444445 | 16.636 |
| 0.8388888888888889 | 16.636 |
| 0.8395833333333332 | 16.636 |
| 0.8402777777777778 | 16.636 |
| 0.8409722222222222 | 16.636 |
| 0.8416666666666667 | 12.257 |
| 0.842361111111111 | 12.257 |
| 0.8430555555555556 | 12.257 |
| 0.84375 | 12.257 |
| 0.8444444444444444 | 12.257 |
| 0.845138888888889 | 12.257 |
| 0.8458333333333333 | 12.257 |
| 0.8465277777777778 | 12.257 |
| 0.8472222222222222 | 7.887 |
| 0.8479166666666668 | 7.887 |
| 0.8486111111111111 | 7.887 |
| 0.8493055555555555 | 7.887 |
| 0.85 | 7.887 |
| 0.8506944444444445 | 7.887 |
| 0.8513888888888889 | 7.887 |
| 0.8520833333333333 | 7.887 |
| 0.8527777777777777 | 3.525 |
| 0.8534722222222223 | 3.525 |
| 0.8541666666666666 | 3.525 |
| 0.8548611111111111 | 3.525 |
| 0.8555555555555556 | 3.525 |
| 0.8562500000000001 | 3.525 |
| 0.8569444444444444 | 3.525 |
| 0.8576388888888888 | 3.525 |
| 0.8583333333333334 | 3.525 |
| 0.8590277777777778 | 3.525 |
| 0.8597222222222222 | 3.525 |
| 0.8604166666666666 | 3.525 |
| 0.8611111111111112 | 0 |
| 0.8618055555555556 | 0 |
| 0.8624999999999999 | 0 |
| 0.8631944444444444 | 0 |
| 0.8638888888888889 | 0 |
| 0.8645833333333334 | 0 |
| 0.8652777777777777 | 0 |
| 0.8659722222222223 | 0 |
| 0.8666666666666667 | 0 |
| 0.8673611111111111 | 0 |
| 0.8680555555555555 | 0 |
| 0.86875 | 0 |
| 0.8694444444444445 | 0 |
| 0.8701388888888889 | 0 |
| 0.8708333333333332 | 0 |
| 0.8715277777777778 | 0 |
| 0.8722222222222222 | 0 |
| 0.8729166666666667 | 0 |
| 0.873611111111111 | 0 |
| 0.8743055555555556 | 0 |
| 0.875 | 0 |
| 0.8756944444444444 | 0 |
| 0.876388888888889 | 0 |
| 0.8770833333333333 | 0 |
| 0.8777777777777778 | 0 |
| 0.8784722222222222 | 0 |
| 0.8791666666666668 | 0 |
| 0.8798611111111111 | 0 |
| 0.8805555555555555 | 0 |
| 0.88125 | 0 |
| 0.8819444444444445 | 0 |
| 0.8826388888888889 | 0 |
| 0.8833333333333333 | 0 |
| 0.8840277777777777 | 0 |
| 0.8847222222222223 | 0 |
| 0.8854166666666666 | 0 |
| 0.8861111111111111 | 0 |
| 0.8868055555555556 | 0 |
| 0.8875000000000001 | 0 |
| 0.8881944444444444 | 0 |
| 0.8888888888888888 | 0 |
| 0.8895833333333334 | 0 |
| 0.8902777777777778 | 0 |
| 0.8909722222222222 | 0 |
| 0.8916666666666666 | 0 |
| 0.8923611111111112 | 0 |
| 0.8930555555555556 | 0 |
| 0.8937499999999999 | 0 |
| 0.8944444444444444 | 0 |
| 0.8951388888888889 | 0 |
| 0.8958333333333334 | 0 |
| 0.8965277777777777 | 0 |
| 0.8972222222222223 | 0 |
| 0.8979166666666667 | 0 |
| 0.8986111111111111 | 0 |
| 0.8993055555555555 | 0 |
| 0.9 | 0 |
| 0.9006944444444445 | 0 |
| 0.9013888888888889 | 0 |
| 0.9020833333333332 | 0 |
| 0.9027777777777778 | 0 |
| 0.9034722222222222 | 0 |
| 0.9041666666666667 | 0 |
| 0.904861111111111 | 0 |
| 0.9055555555555556 | 0 |
| 0.90625 | 0 |
| 0.9069444444444444 | 0 |
| 0.907638888888889 | 0 |
| 0.9083333333333333 | 0 |
| 0.9090277777777778 | 0 |
| 0.9097222222222222 | 0 |
| 0.9104166666666668 | 0 |
| 0.9111111111111111 | 0 |
| 0.9118055555555555 | 0 |
| 0.9125 | 0 |
| 0.9131944444444445 | 0 |
| 0.9138888888888889 | 0 |
| 0.9145833333333333 | 0 |
| 0.9152777777777777 | 0 |
| 0.9159722222222223 | 0 |
| 0.9166666666666666 | 0 |
| 0.9173611111111111 | 0 |
| 0.9180555555555556 | 0 |
| 0.9187500000000001 | 0 |
| 0.9194444444444444 | 0 |
| 0.9201388888888888 | 0 |
| 0.9208333333333334 | 0 |
| 0.9215277777777778 | 0 |
| 0.9222222222222222 | 0 |
| 0.9229166666666666 | 0 |
| 0.9236111111111112 | 0 |
| 0.9243055555555556 | 0 |
| 0.9249999999999999 | 0 |
| 0.9256944444444444 | 0 |
| 0.9263888888888889 | 0 |
| 0.9270833333333334 | 0 |
| 0.9277777777777777 | 0 |
| 0.9284722222222223 | 0 |
| 0.9291666666666667 | 0 |
| 0.9298611111111111 | 0 |
| 0.9305555555555555 | 0 |
| 0.93125 | 0 |
| 0.9319444444444445 | 0 |
| 0.9326388888888889 | 0 |
| 0.9333333333333332 | 0 |
| 0.9340277777777778 | 0 |
| 0.9347222222222222 | 0 |
| 0.9354166666666667 | 0 |
| 0.936111111111111 | 0 |
| 0.9368055555555556 | 0 |
| 0.9375 | 0 |
| 0.9381944444444444 | 0 |
| 0.938888888888889 | 0 |
| 0.9395833333333333 | 0 |
| 0.9402777777777778 | 0 |
| 0.9409722222222222 | 0 |
| 0.9416666666666668 | 0 |
| 0.9423611111111111 | 0 |
| 0.9430555555555555 | 0 |
| 0.94375 | 0 |
| 0.9444444444444445 | 0 |
| 0.9451388888888889 | 0 |
| 0.9458333333333333 | 0 |
| 0.9465277777777777 | 0 |
| 0.9472222222222223 | 0 |
| 0.9479166666666666 | 0 |
| 0.9486111111111111 | 0 |
| 0.9493055555555556 | 0 |
| 0.9500000000000001 | 0 |
| 0.9506944444444444 | 0 |
| 0.9513888888888888 | 0 |
| 0.9520833333333334 | 0 |
| 0.9527777777777778 | 0 |
| 0.9534722222222222 | 0 |
| 0.9541666666666666 | 0 |
| 0.9548611111111112 | 0 |
| 0.9555555555555556 | 0 |
| 0.9562499999999999 | 0 |
| 0.9569444444444444 | 0 |
| 0.9576388888888889 | 0 |
| 0.9583333333333334 | 0 |
| 0.9590277777777777 | 0 |
| 0.9597222222222223 | 0 |
| 0.9604166666666667 | 0 |
| 0.9611111111111111 | 0 |
| 0.9618055555555555 | 0 |
| 0.9625 | 0 |
| 0.9631944444444445 | 0 |
| 0.9638888888888889 | 0 |
| 0.9645833333333332 | 0 |
| 0.9652777777777778 | 0 |
| 0.9659722222222222 | 0 |
| 0.9666666666666667 | 0 |
| 0.967361111111111 | 0 |
| 0.9680555555555556 | 0 |
| 0.96875 | 0 |
| 0.9694444444444444 | 0 |
| 0.970138888888889 | 0 |
| 0.9708333333333333 | 0 |
| 0.9715277777777778 | 0 |
| 0.9722222222222222 | 0 |
| 0.9729166666666668 | 0 |
| 0.9736111111111111 | 0 |
| 0.9743055555555555 | 0 |
| 0.975 | 0 |
| 0.9756944444444445 | 0 |
| 0.9763888888888889 | 0 |
| 0.9770833333333333 | 0 |
| 0.9777777777777777 | 0 |
| 0.9784722222222223 | 0 |
| 0.9791666666666666 | 0 |
| 0.9798611111111111 | 0 |
| 0.9805555555555556 | 0 |
| 0.9812500000000001 | 0 |
| 0.9819444444444444 | 0 |
| 0.9826388888888888 | 0 |
| 0.9833333333333334 | 0 |
| 0.9840277777777778 | 0 |
| 0.9847222222222222 | 0 |
| 0.9854166666666666 | 0 |
| 0.9861111111111112 | 0 |
| 0.9868055555555556 | 0 |
| 0.9874999999999999 | 0 |
| 0.9881944444444444 | 0 |
| 0.9888888888888889 | 0 |
| 0.9895833333333334 | 0 |
| 0.9902777777777777 | 0 |
| 0.9909722222222223 | 0 |
| 0.9916666666666667 | 0 |
| 0.9923611111111111 | 0 |
| 0.9930555555555555 | 0 |
| 0.99375 | 0 |
| 0.9944444444444445 | 0 |
| 0.9951388888888889 | 0 |
| 0.9958333333333332 | 0 |
| 0.9965277777777778 | 0 |
| 0.9972222222222222 | 0 |
| 0.9979166666666667 | 0 |
| 0.998611111111111 | 0 |
| 0.9993055555555556 | 0 |